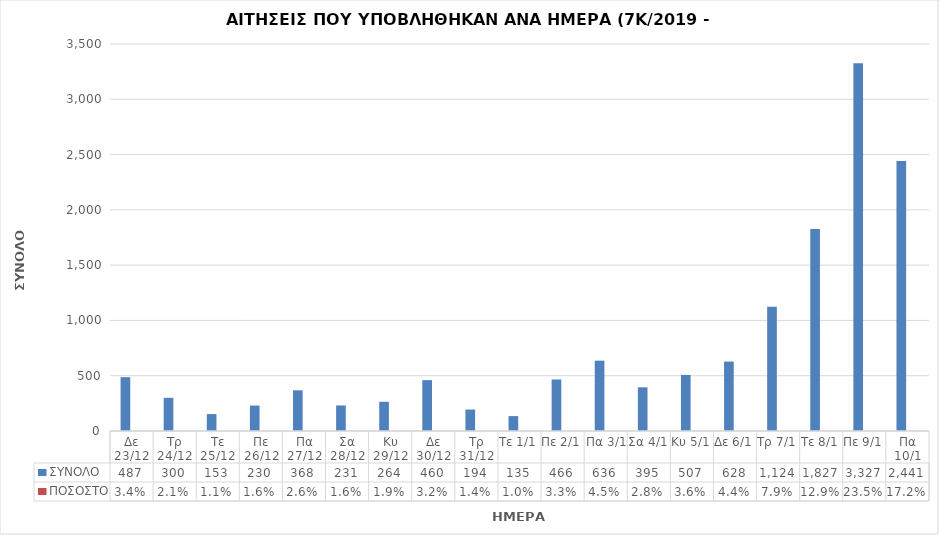
| Category | ΣΥΝΟΛΟ | ΠΟΣΟΣΤΟ |
|---|---|---|
| Δε 23/12 | 487 | 0.034 |
| Τρ 24/12 | 300 | 0.021 |
| Τε 25/12 | 153 | 0.011 |
| Πε 26/12 | 230 | 0.016 |
| Πα 27/12 | 368 | 0.026 |
| Σα 28/12 | 231 | 0.016 |
| Κυ 29/12 | 264 | 0.019 |
| Δε 30/12 | 460 | 0.032 |
| Τρ 31/12 | 194 | 0.014 |
| Τε 1/1 | 135 | 0.01 |
| Πε 2/1 | 466 | 0.033 |
| Πα 3/1 | 636 | 0.045 |
| Σα 4/1 | 395 | 0.028 |
| Κυ 5/1 | 507 | 0.036 |
| Δε 6/1 | 628 | 0.044 |
| Τρ 7/1 | 1124 | 0.079 |
| Τε 8/1 | 1827 | 0.129 |
| Πε 9/1 | 3327 | 0.235 |
| Πα 10/1 | 2441 | 0.172 |